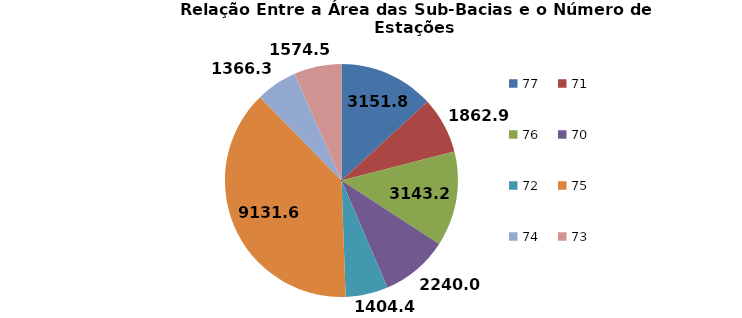
| Category | Área (km2)/N° de Estaçõesb,c,d |
|---|---|
| 77.0 | 3151.765 |
| 71.0 | 1862.913 |
| 76.0 | 3143.209 |
| 70.0 | 2239.964 |
| 72.0 | 1404.402 |
| 75.0 | 9131.642 |
| 74.0 | 1366.282 |
| 73.0 | 1574.468 |